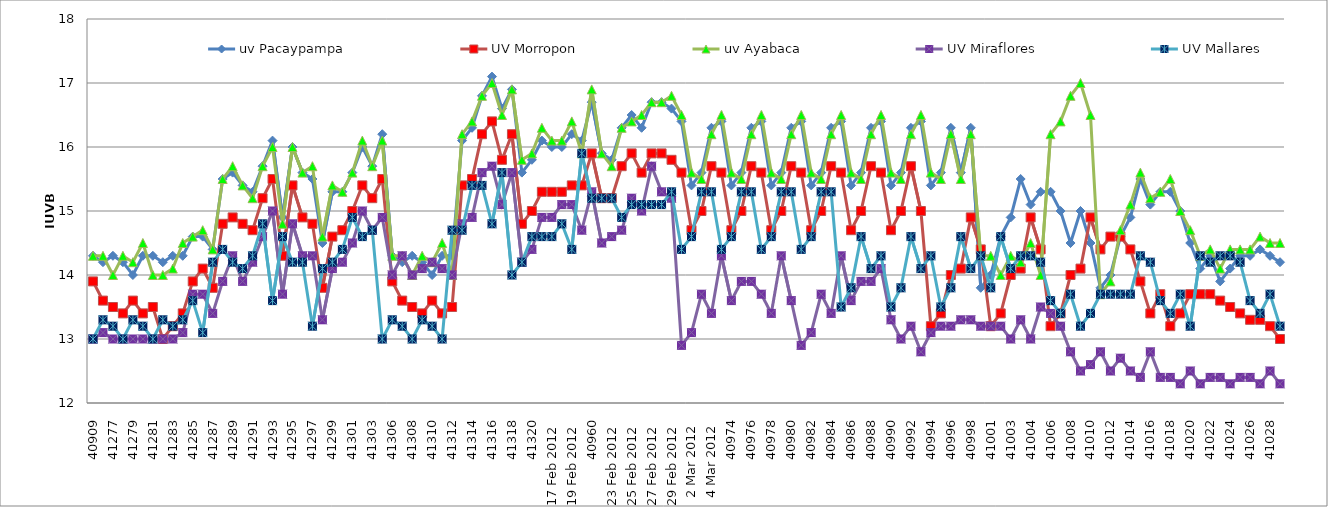
| Category | uv Pacaypampa | UV Morropon | uv Ayabaca | UV Miraflores | UV Mallares |
|---|---|---|---|---|---|
| 40909 | 14.3 | 13.9 | 14.3 | 13 | 13 |
| 41276 | 14.2 | 13.6 | 14.3 | 13.1 | 13.3 |
| 41277 | 14.3 | 13.5 | 14 | 13 | 13.2 |
| 41278 | 14.2 | 13.4 | 14.3 | 13 | 13 |
| 41279 | 14 | 13.6 | 14.2 | 13 | 13.3 |
| 41280 | 14.3 | 13.4 | 14.5 | 13 | 13.2 |
| 41281 | 14.3 | 13.5 | 14 | 13 | 13 |
| 41282 | 14.2 | 13 | 14 | 13 | 13.3 |
| 41283 | 14.3 | 13.2 | 14.1 | 13 | 13.2 |
| 41284 | 14.3 | 13.4 | 14.5 | 13.1 | 13.3 |
| 41285 | 14.6 | 13.9 | 14.6 | 13.7 | 13.6 |
| 41286 | 14.6 | 14.1 | 14.7 | 13.7 | 13.1 |
| 41287 | 14.4 | 13.8 | 14.4 | 13.4 | 14.2 |
| 41288 | 15.5 | 14.8 | 15.5 | 13.9 | 14.4 |
| 41289 | 15.6 | 14.9 | 15.7 | 14.3 | 14.2 |
| 41290 | 15.4 | 14.8 | 15.4 | 13.9 | 14.1 |
| 41291 | 15.3 | 14.7 | 15.2 | 14.2 | 14.3 |
| 41292 | 15.7 | 15.2 | 15.7 | 14.6 | 14.8 |
| 41293 | 16.1 | 15.5 | 16 | 15 | 13.6 |
| 41294 | 14.9 | 14.3 | 14.8 | 13.7 | 14.6 |
| 41295 | 16 | 15.4 | 16 | 14.8 | 14.2 |
| 41296 | 15.6 | 14.9 | 15.6 | 14.3 | 14.2 |
| 41297 | 15.5 | 14.8 | 15.7 | 14.3 | 13.2 |
| 41298 | 14.5 | 13.8 | 14.6 | 13.3 | 14.1 |
| 41299 | 15.3 | 14.6 | 15.4 | 14.1 | 14.2 |
| 41300 | 15.3 | 14.7 | 15.3 | 14.2 | 14.4 |
| 41301 | 15.6 | 15 | 15.6 | 14.5 | 14.9 |
| 41302 | 16 | 15.4 | 16.1 | 15 | 14.6 |
| 41303 | 15.7 | 15.2 | 15.7 | 14.7 | 14.7 |
| 41304 | 16.2 | 15.5 | 16.1 | 14.9 | 13 |
| 41306 | 14.3 | 13.9 | 14.3 | 14 | 13.3 |
| 41307 | 14.2 | 13.6 | 14.3 | 14.3 | 13.2 |
| 41308 | 14.3 | 13.5 | 14 | 14 | 13 |
| 41309 | 14.2 | 13.4 | 14.3 | 14.1 | 13.3 |
| 41310 | 14 | 13.6 | 14.2 | 14.2 | 13.2 |
| 41311 | 14.3 | 13.4 | 14.5 | 14.1 | 13 |
| 41312 | 14.3 | 13.5 | 14 | 14 | 14.7 |
| 41313 | 16.1 | 15.4 | 16.2 | 14.8 | 14.7 |
| 41314 | 16.3 | 15.5 | 16.4 | 14.9 | 15.4 |
| 41315 | 16.8 | 16.2 | 16.8 | 15.6 | 15.4 |
| 41316 | 17.1 | 16.4 | 17 | 15.7 | 14.8 |
| 41317 | 16.6 | 15.8 | 16.5 | 15.1 | 15.6 |
| 41318 | 16.9 | 16.2 | 16.9 | 15.6 | 14 |
| 41319 | 15.6 | 14.8 | 15.8 | 14.2 | 14.2 |
| 41320 | 15.8 | 15 | 15.9 | 14.4 | 14.6 |
| 40955 | 16.1 | 15.3 | 16.3 | 14.9 | 14.6 |
|   17 Feb 2012  | 16 | 15.3 | 16.1 | 14.9 | 14.6 |
|   18 Feb 2012  | 16 | 15.3 | 16.1 | 15.1 | 14.8 |
|   19 Feb 2012  | 16.2 | 15.4 | 16.4 | 15.1 | 14.4 |
|  20 Feb 2012   | 16.1 | 15.4 | 15.9 | 14.7 | 15.9 |
| 40960 | 16.7 | 15.9 | 16.9 | 15.3 | 15.2 |
|   22 Feb 2012  | 15.9 | 15.2 | 15.9 | 14.5 | 15.2 |
|   23 Feb 2012  | 15.8 | 15.2 | 15.7 | 14.6 | 15.2 |
|  24 Feb 2012   | 16.3 | 15.7 | 16.3 | 14.7 | 14.9 |
|   25 Feb 2012  | 16.5 | 15.9 | 16.4 | 15.2 | 15.1 |
|   26 Feb 2012  | 16.3 | 15.6 | 16.5 | 15 | 15.1 |
|   27 Feb 2012  | 16.7 | 15.9 | 16.7 | 15.7 | 15.1 |
|   28 Feb 2012  | 16.7 | 15.9 | 16.7 | 15.3 | 15.1 |
|   29 Feb 2012  | 16.6 | 15.8 | 16.8 | 15.2 | 15.3 |
| 40969 | 16.4 | 15.6 | 16.5 | 12.9 | 14.4 |
|   2 Mar 2012  | 15.4 | 14.7 | 15.6 | 13.1 | 14.6 |
|   3 Mar 2012  | 15.6 | 15 | 15.5 | 13.7 | 15.3 |
|   4 Mar 2012  | 16.3 | 15.7 | 16.2 | 13.4 | 15.3 |
| 40973 | 16.4 | 15.6 | 16.5 | 14.3 | 14.4 |
| 40974 | 15.4 | 14.7 | 15.6 | 13.6 | 14.6 |
| 40975 | 15.6 | 15 | 15.5 | 13.9 | 15.3 |
| 40976 | 16.3 | 15.7 | 16.2 | 13.9 | 15.3 |
| 40977 | 16.4 | 15.6 | 16.5 | 13.7 | 14.4 |
| 40978 | 15.4 | 14.7 | 15.6 | 13.4 | 14.6 |
| 40979 | 15.6 | 15 | 15.5 | 14.3 | 15.3 |
| 40980 | 16.3 | 15.7 | 16.2 | 13.6 | 15.3 |
| 40981 | 16.4 | 15.6 | 16.5 | 12.9 | 14.4 |
| 40982 | 15.4 | 14.7 | 15.6 | 13.1 | 14.6 |
| 40983 | 15.6 | 15 | 15.5 | 13.7 | 15.3 |
| 40984 | 16.3 | 15.7 | 16.2 | 13.4 | 15.3 |
| 40985 | 16.4 | 15.6 | 16.5 | 14.3 | 13.5 |
| 40986 | 15.4 | 14.7 | 15.6 | 13.6 | 13.8 |
| 19/03/1012 | 15.6 | 15 | 15.5 | 13.9 | 14.6 |
| 40988 | 16.3 | 15.7 | 16.2 | 13.9 | 14.1 |
| 40989 | 16.4 | 15.6 | 16.5 | 14.1 | 14.3 |
| 40990 | 15.4 | 14.7 | 15.6 | 13.3 | 13.5 |
| 40991 | 15.6 | 15 | 15.5 | 13 | 13.8 |
| 40992 | 16.3 | 15.7 | 16.2 | 13.2 | 14.6 |
| 40993 | 16.4 | 15 | 16.5 | 12.8 | 14.1 |
| 40994 | 15.4 | 13.2 | 15.6 | 13.1 | 14.3 |
| 40995 | 15.6 | 13.4 | 15.5 | 13.2 | 13.5 |
| 40996 | 16.3 | 14 | 16.2 | 13.2 | 13.8 |
| 40997 | 15.6 | 14.1 | 15.5 | 13.3 | 14.6 |
| 40998 | 16.3 | 14.9 | 16.2 | 13.3 | 14.1 |
| 41000 | 13.8 | 14.4 | 14.3 | 13.2 | 14.3 |
| 41001 | 14 | 13.2 | 14.3 | 13.2 | 13.8 |
| 41002 | 14.6 | 13.4 | 14 | 13.2 | 14.6 |
| 41003 | 14.9 | 14 | 14.3 | 13 | 14.1 |
| 41004 | 15.5 | 14.1 | 14.2 | 13.3 | 14.3 |
| 41004 | 15.1 | 14.9 | 14.5 | 13 | 14.3 |
| 41005 | 15.3 | 14.4 | 14 | 13.5 | 14.2 |
| 41006 | 15.3 | 13.2 | 16.2 | 13.4 | 13.6 |
| 41007 | 15 | 13.4 | 16.4 | 13.2 | 13.4 |
| 41008 | 14.5 | 14 | 16.8 | 12.8 | 13.7 |
| 41009 | 15 | 14.1 | 17 | 12.5 | 13.2 |
| 41010 | 14.5 | 14.9 | 16.5 | 12.6 | 13.4 |
| 41011 | 13.8 | 14.4 | 13.7 | 12.8 | 13.7 |
| 41012 | 14 | 14.6 | 13.9 | 12.5 | 13.7 |
| 41013 | 14.6 | 14.6 | 14.7 | 12.7 | 13.7 |
| 41014 | 14.9 | 14.4 | 15.1 | 12.5 | 13.7 |
| 41015 | 15.5 | 13.9 | 15.6 | 12.4 | 14.3 |
| 41016 | 15.1 | 13.4 | 15.2 | 12.8 | 14.2 |
| 41017 | 15.3 | 13.7 | 15.3 | 12.4 | 13.6 |
| 41018 | 15.3 | 13.2 | 15.5 | 12.4 | 13.4 |
| 41019 | 15 | 13.4 | 15 | 12.3 | 13.7 |
| 41020 | 14.5 | 13.7 | 14.7 | 12.5 | 13.2 |
| 41021 | 14.1 | 13.7 | 14.3 | 12.3 | 14.3 |
| 41022 | 14.3 | 13.7 | 14.4 | 12.4 | 14.2 |
| 41023 | 13.9 | 13.6 | 14.1 | 12.4 | 14.3 |
| 41024 | 14.1 | 13.5 | 14.4 | 12.3 | 14.3 |
| 41025 | 14.3 | 13.4 | 14.4 | 12.4 | 14.2 |
| 41026 | 14.3 | 13.3 | 14.4 | 12.4 | 13.6 |
| 41027 | 14.4 | 13.3 | 14.6 | 12.3 | 13.4 |
| 41028 | 14.3 | 13.2 | 14.5 | 12.5 | 13.7 |
| 41029 | 14.2 | 13 | 14.5 | 12.3 | 13.2 |